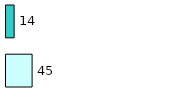
| Category | Series 0 | Series 1 |
|---|---|---|
| 0 | 45 | 14 |